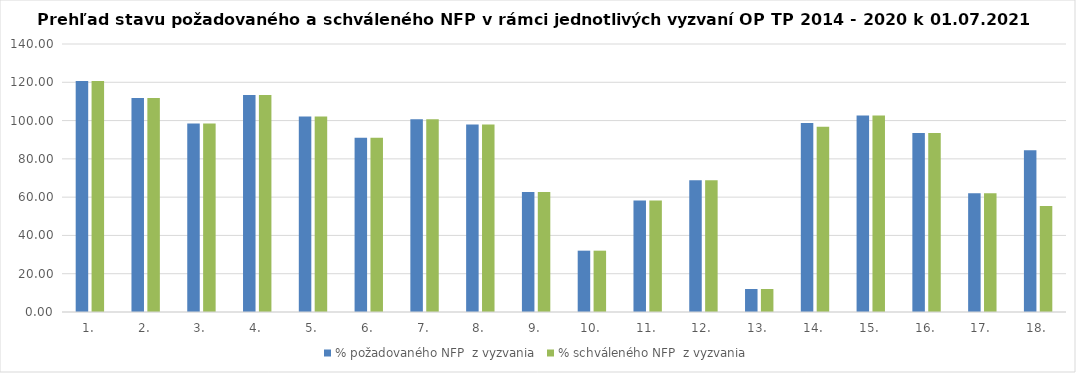
| Category | % požadovaného NFP  z vyzvania | % schváleného NFP  z vyzvania |
|---|---|---|
| 1. | 120.662 | 120.662 |
| 2. | 111.83 | 111.83 |
| 3. | 98.465 | 98.465 |
| 4. | 113.295 | 113.295 |
| 5. | 102.19 | 102.19 |
| 6. | 91.016 | 91.016 |
| 7. | 100.637 | 100.637 |
| 8. | 97.989 | 97.989 |
| 9. | 62.721 | 62.721 |
| 10. | 32.038 | 32.038 |
| 11. | 58.283 | 58.283 |
| 12. | 68.88 | 68.88 |
| 13. | 12.008 | 12.008 |
| 14. | 98.721 | 96.809 |
| 15. | 102.693 | 102.693 |
| 16. | 93.51 | 93.51 |
| 17. | 61.969 | 61.969 |
| 18. | 84.514 | 55.313 |